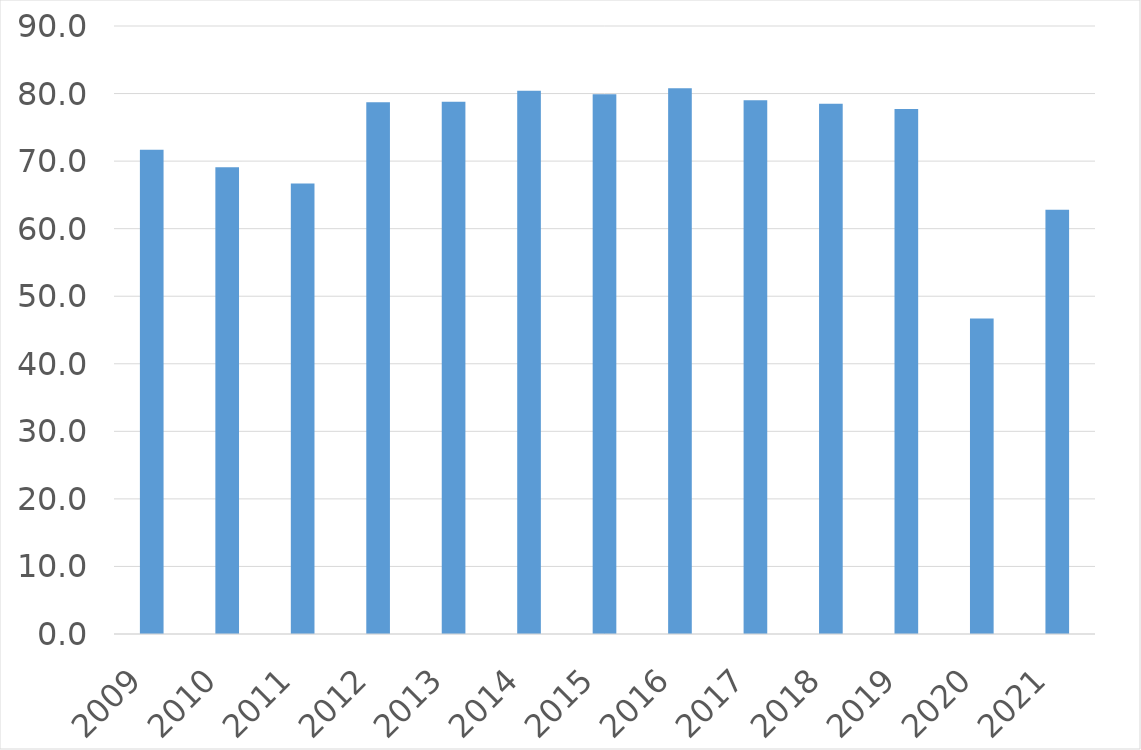
| Category | Series 0 |
|---|---|
| 2009 | 71.7 |
| 2010 | 69.1 |
| 2011 | 66.7 |
| 2012 | 78.7 |
| 2013 | 78.8 |
| 2014 | 80.4 |
| 2015 | 79.9 |
| 2016 | 80.8 |
| 2017 | 79 |
| 2018 | 78.5 |
| 2019 | 77.7 |
| 2020 | 46.7 |
| 2021 | 62.8 |